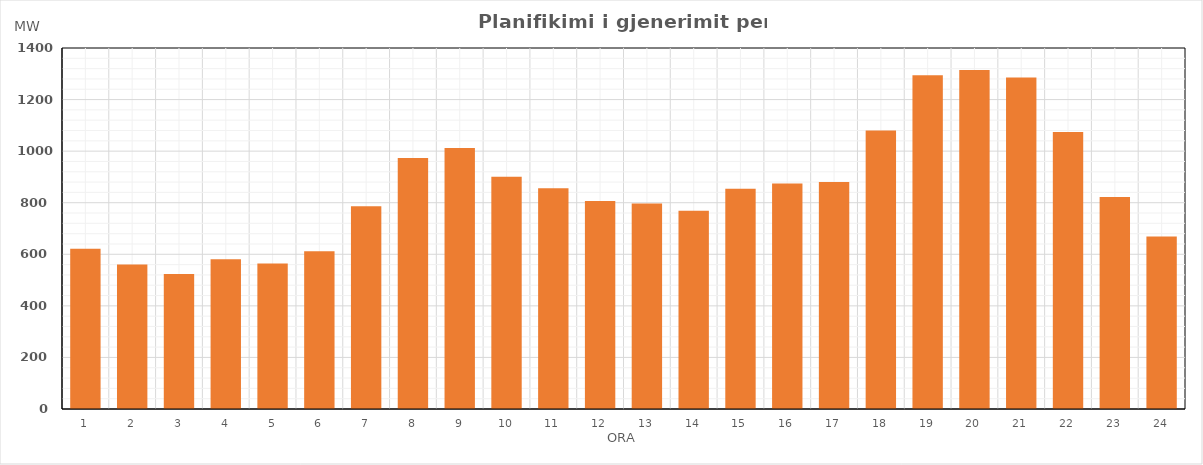
| Category | Max (MW) |
|---|---|
| 0 | 621.37 |
| 1 | 560.6 |
| 2 | 523.57 |
| 3 | 580.56 |
| 4 | 564.56 |
| 5 | 611.56 |
| 6 | 786.5 |
| 7 | 973.52 |
| 8 | 1012.54 |
| 9 | 900.27 |
| 10 | 856.37 |
| 11 | 806.3 |
| 12 | 797.34 |
| 13 | 768.76 |
| 14 | 854.4 |
| 15 | 874.38 |
| 16 | 880.75 |
| 17 | 1080.3 |
| 18 | 1294.41 |
| 19 | 1314.4 |
| 20 | 1285.52 |
| 21 | 1074.64 |
| 22 | 822.34 |
| 23 | 669.28 |